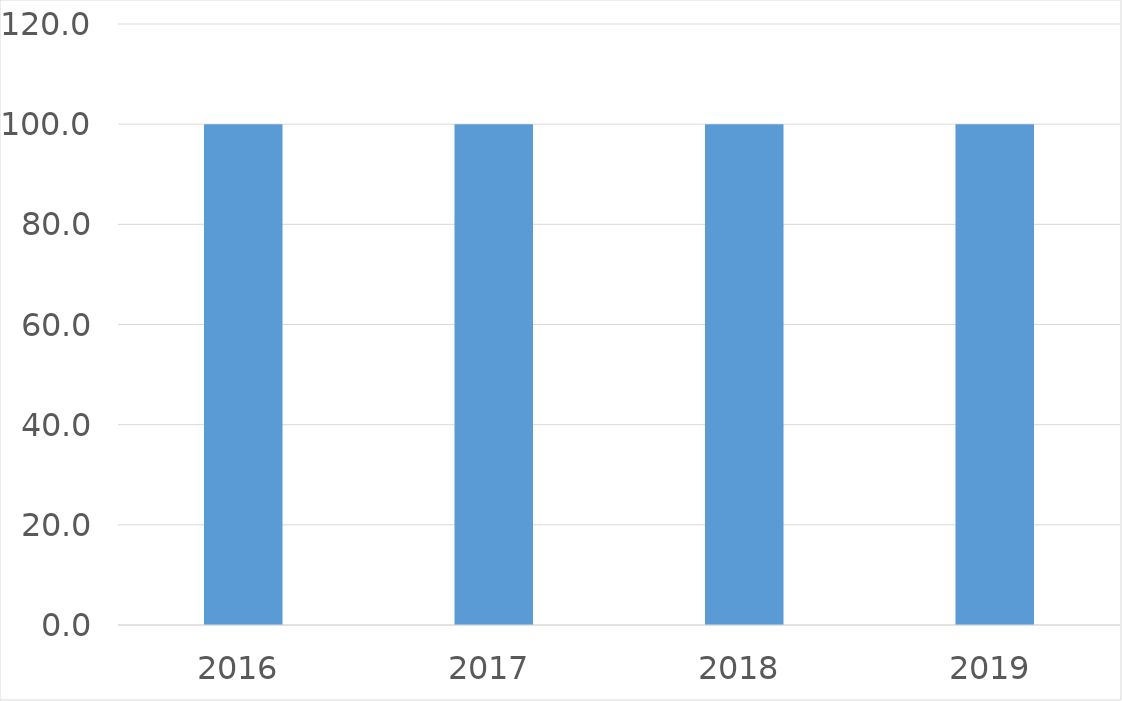
| Category | Series 0 |
|---|---|
| 2016 | 100 |
| 2017 | 100 |
| 2018 | 100 |
| 2019 | 100 |